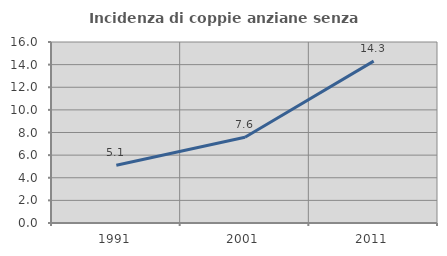
| Category | Incidenza di coppie anziane senza figli  |
|---|---|
| 1991.0 | 5.111 |
| 2001.0 | 7.584 |
| 2011.0 | 14.31 |